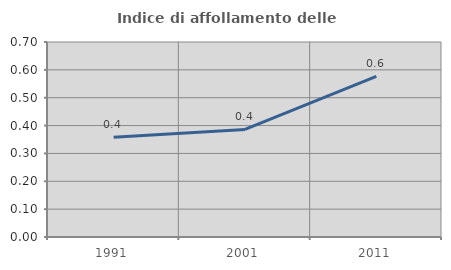
| Category | Indice di affollamento delle abitazioni  |
|---|---|
| 1991.0 | 0.358 |
| 2001.0 | 0.386 |
| 2011.0 | 0.577 |